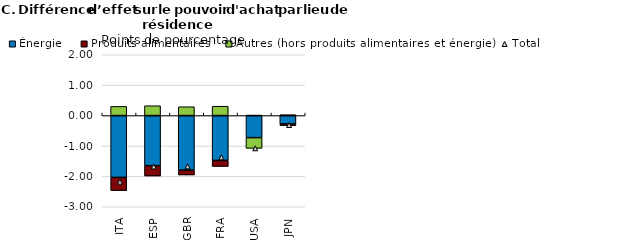
| Category | Énergie | Produits alimentaires | Autres (hors produits alimentaires et énergie) |
|---|---|---|---|
| ITA | -2.034 | -0.434 | 0.302 |
| ESP | -1.647 | -0.341 | 0.323 |
| GBR | -1.796 | -0.158 | 0.29 |
| FRA | -1.475 | -0.199 | 0.308 |
| USA | -0.726 | 0.011 | -0.354 |
| JPN | -0.276 | -0.054 | 0.027 |